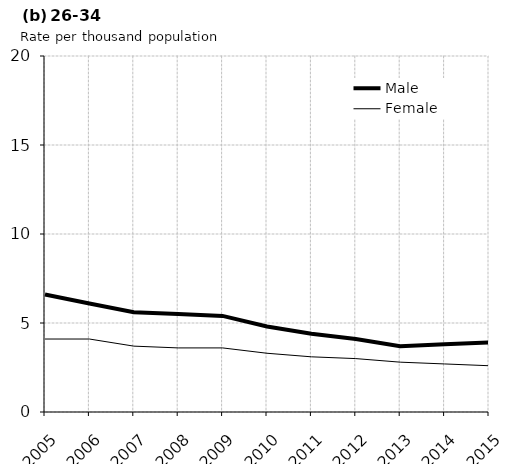
| Category | Male | Female |
|---|---|---|
| 2005.0 | 6.6 | 4.1 |
| 2006.0 | 6.1 | 4.1 |
| 2007.0 | 5.6 | 3.7 |
| 2008.0 | 5.5 | 3.6 |
| 2009.0 | 5.4 | 3.6 |
| 2010.0 | 4.8 | 3.3 |
| 2011.0 | 4.4 | 3.1 |
| 2012.0 | 4.1 | 3 |
| 2013.0 | 3.7 | 2.8 |
| 2014.0 | 3.8 | 2.7 |
| 2015.0 | 3.9 | 2.6 |